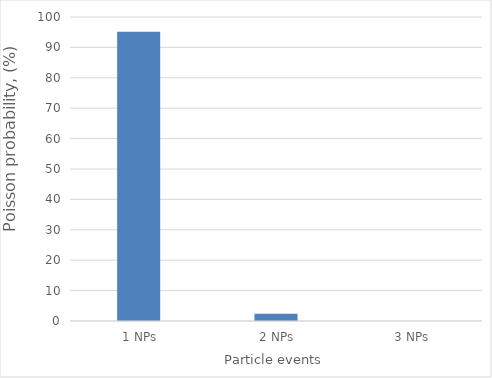
| Category | Poisson probability to observe NPs for given dt (%) : |
|---|---|
|  1 NPs | 95.123 |
|  2 NPs | 2.378 |
| 3 NPs | 0.04 |